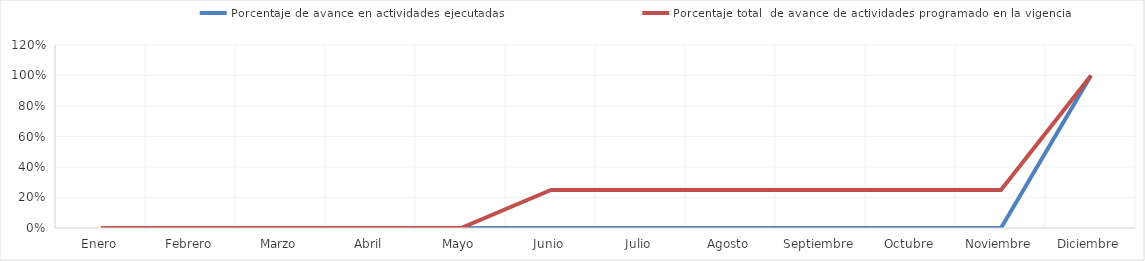
| Category | Porcentaje de avance en actividades ejecutadas | Porcentaje total  de avance de actividades programado en la vigencia |
|---|---|---|
| 0 | 0 | 0 |
| 1 | 0 | 0 |
| 2 | 0 | 0 |
| 3 | 0 | 0 |
| 4 | 0 | 0 |
| 5 | 0 | 0.25 |
| 6 | 0 | 0.25 |
| 7 | 0 | 0.25 |
| 8 | 0 | 0.25 |
| 9 | 0 | 0.25 |
| 10 | 0 | 0.25 |
| 11 | 1 | 1 |